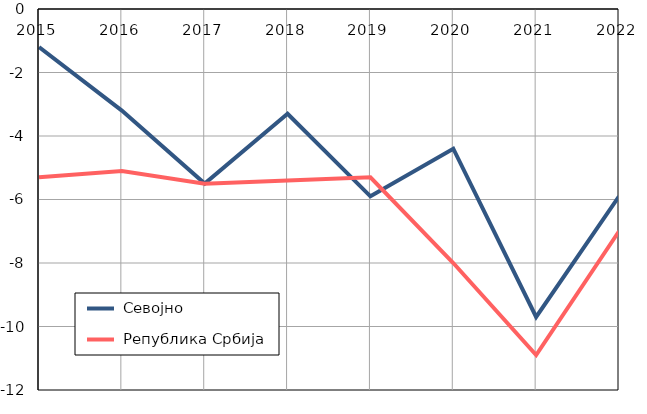
| Category |  Севојно |  Република Србија |
|---|---|---|
| 2015.0 | -1.2 | -5.3 |
| 2016.0 | -3.2 | -5.1 |
| 2017.0 | -5.5 | -5.5 |
| 2018.0 | -3.3 | -5.4 |
| 2019.0 | -5.9 | -5.3 |
| 2020.0 | -4.4 | -8 |
| 2021.0 | -9.7 | -10.9 |
| 2022.0 | -5.9 | -7 |